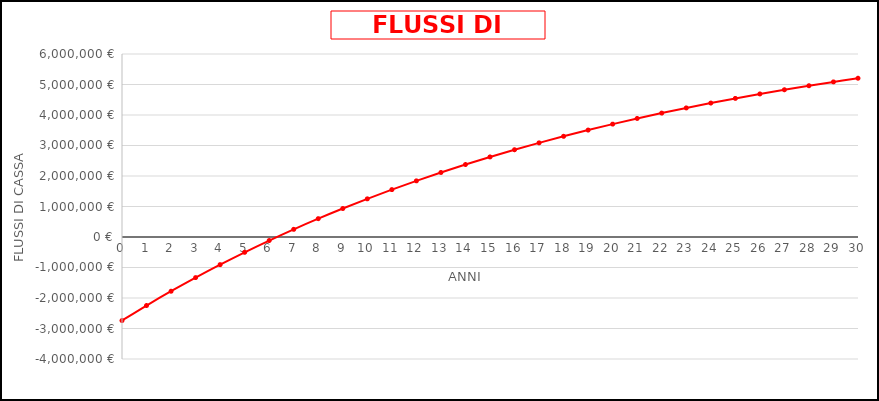
| Category | Series 0 |
|---|---|
| 0.0 | -2738754.953 |
| 1.0 | -2246613.592 |
| 2.0 | -1777907.533 |
| 3.0 | -1331520.811 |
| 4.0 | -906390.599 |
| 5.0 | -501504.683 |
| 6.0 | -115899.049 |
| 7.0 | 251344.412 |
| 8.0 | 601100.089 |
| 9.0 | 934200.734 |
| 10.0 | 1251439.444 |
| 11.0 | 1553571.548 |
| 12.0 | 1841316.41 |
| 13.0 | 2115359.135 |
| 14.0 | 2376352.206 |
| 15.0 | 2624917.036 |
| 16.0 | 2861645.446 |
| 17.0 | 3087101.074 |
| 18.0 | 3301820.719 |
| 19.0 | 3506315.62 |
| 20.0 | 3701072.669 |
| 21.0 | 3886555.572 |
| 22.0 | 4063205.956 |
| 23.0 | 4231444.417 |
| 24.0 | 4391671.522 |
| 25.0 | 4544268.766 |
| 26.0 | 4689599.474 |
| 27.0 | 4828009.672 |
| 28.0 | 4959828.908 |
| 29.0 | 5085371.038 |
| 30.0 | 5204934.971 |